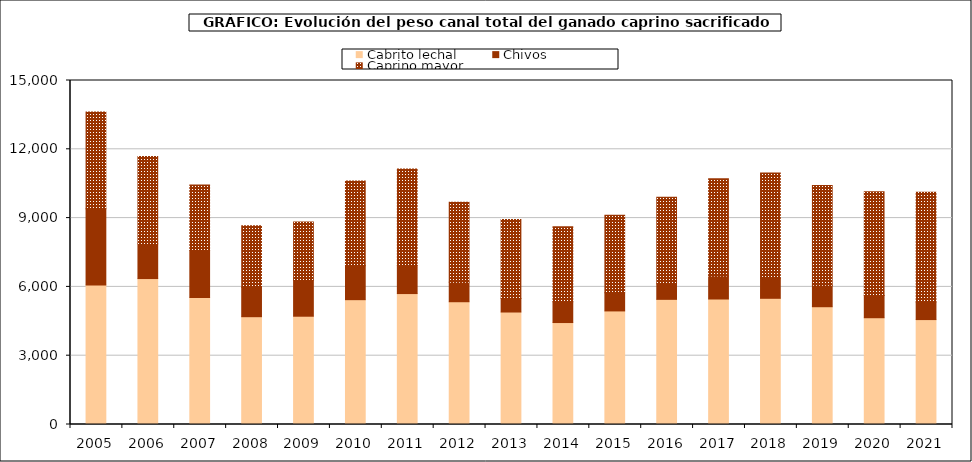
| Category | Cabrito lechal | Chivos | Caprino mayor |
|---|---|---|---|
| 2005.0 | 6081.5 | 3326.197 | 4213.791 |
| 2006.0 | 6363.804 | 1514.071 | 3812.237 |
| 2007.0 | 5538.187 | 2055.519 | 2852.212 |
| 2008.0 | 4700.787 | 1279.039 | 2682.444 |
| 2009.0 | 4721.591 | 1569.493 | 2539.825 |
| 2010.0 | 5443.269 | 1481.101 | 3693.873 |
| 2011.0 | 5709.183 | 1237.105 | 4195.759 |
| 2012.0 | 5353.402 | 854.156 | 3488.702 |
| 2013.0 | 4904.881 | 592.234 | 3442.821 |
| 2014.0 | 4445.773 | 905.526 | 3270.219 |
| 2015.0 | 4952.564 | 787.441 | 3379.656 |
| 2016.0 | 5457.161 | 675.571 | 3771.302 |
| 2017.0 | 5472.065 | 1000.592 | 4240.75 |
| 2018.0 | 5503.007 | 875.093 | 4592.59 |
| 2019.0 | 5135.593 | 934.336 | 4349.983 |
| 2020.0 | 4656.03 | 969.368 | 4523.981 |
| 2021.0 | 4574.941 | 762.154 | 4790.221 |